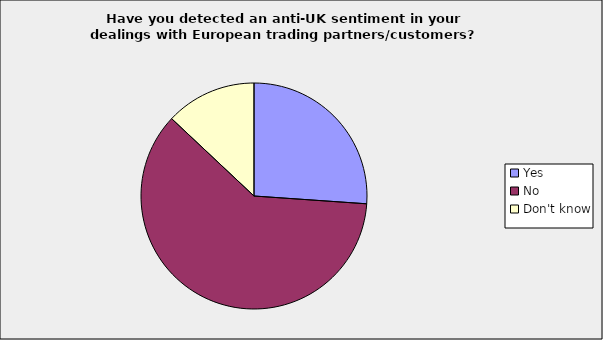
| Category | Series 0 |
|---|---|
| Yes | 0.261 |
| No | 0.609 |
| Don't know | 0.13 |